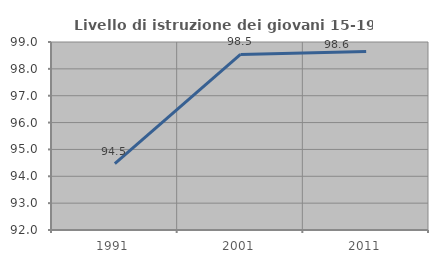
| Category | Livello di istruzione dei giovani 15-19 anni |
|---|---|
| 1991.0 | 94.468 |
| 2001.0 | 98.537 |
| 2011.0 | 98.645 |